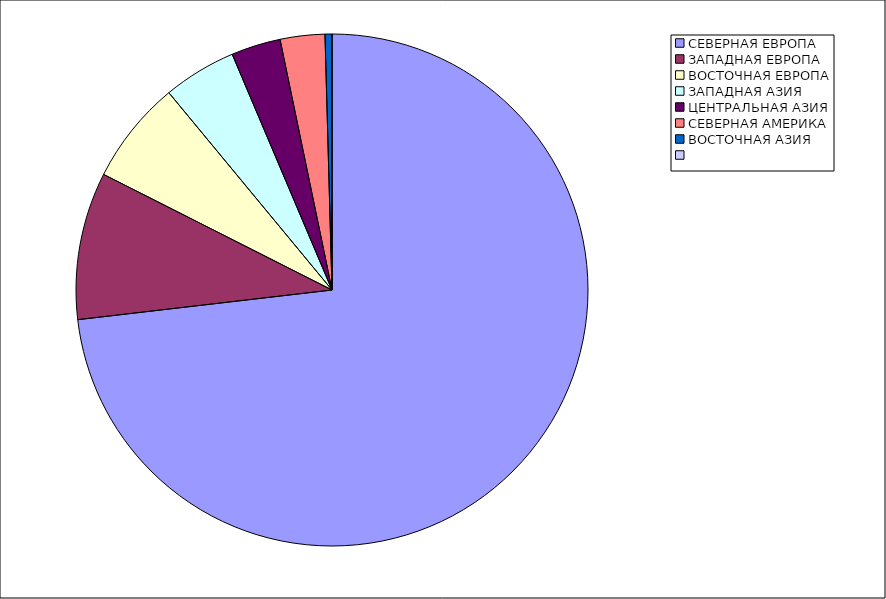
| Category | Оборот |
|---|---|
| СЕВЕРНАЯ ЕВРОПА | 73.15 |
| ЗАПАДНАЯ ЕВРОПА | 9.306 |
| ВОСТОЧНАЯ ЕВРОПА | 6.547 |
| ЗАПАДНАЯ АЗИЯ | 4.623 |
| ЦЕНТРАЛЬНАЯ АЗИЯ | 3.119 |
| СЕВЕРНАЯ АМЕРИКА | 2.819 |
| ВОСТОЧНАЯ АЗИЯ | 0.436 |